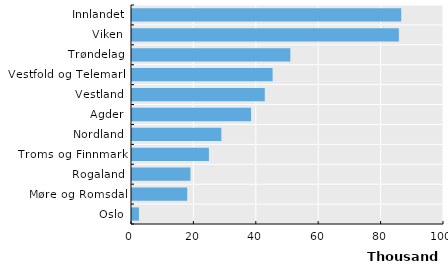
| Category | Series 0 |
|---|---|
| Innlandet | 86284 |
| Viken | 85528 |
| Trøndelag | 50748 |
| Vestfold og Telemark | 45063 |
| Vestland | 42555 |
| Agder | 38145 |
| Nordland | 28631 |
| Troms og Finnmark | 24646 |
| Rogaland | 18734 |
| Møre og Romsdal | 17692 |
| Oslo | 2215 |